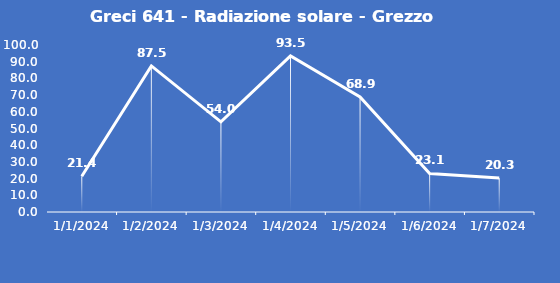
| Category | Greci 641 - Radiazione solare - Grezzo (W/m2) |
|---|---|
| 1/1/24 | 21.4 |
| 1/2/24 | 87.5 |
| 1/3/24 | 54 |
| 1/4/24 | 93.5 |
| 1/5/24 | 68.9 |
| 1/6/24 | 23.1 |
| 1/7/24 | 20.3 |